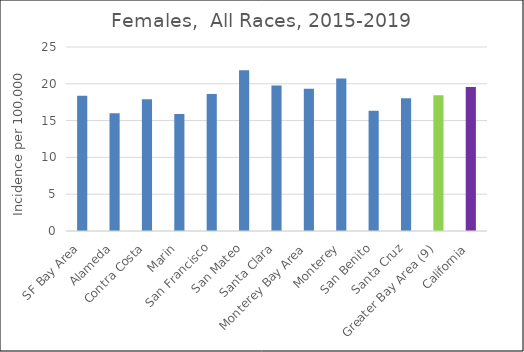
| Category | Female |
|---|---|
| SF Bay Area | 18.39 |
|   Alameda | 16.01 |
|   Contra Costa | 17.89 |
|   Marin | 15.89 |
|   San Francisco | 18.62 |
|   San Mateo | 21.83 |
|   Santa Clara | 19.78 |
| Monterey Bay Area | 19.32 |
|   Monterey | 20.71 |
|   San Benito | 16.35 |
|   Santa Cruz | 18.04 |
| Greater Bay Area (9) | 18.46 |
| California | 19.56 |